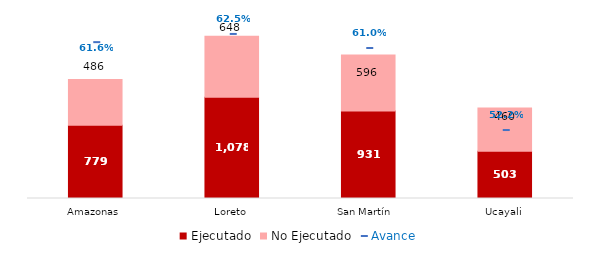
| Category | Ejecutado | No Ejecutado |
|---|---|---|
| Amazonas | 778.987 | 485.997 |
| Loreto | 1078.423 | 648.356 |
| San Martín  | 930.719 | 596.18 |
| Ucayali | 503.253 | 460.273 |